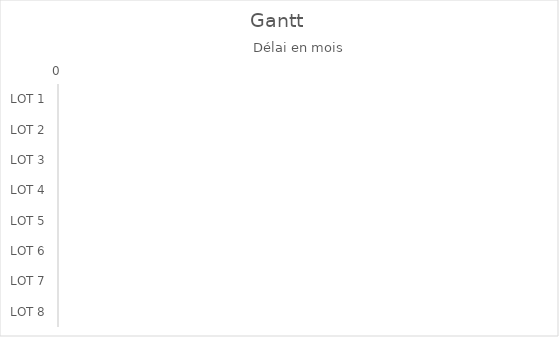
| Category | Series 0 | Series 1 |
|---|---|---|
| LOT 1 | 0 | 0 |
| LOT 2 | 0 | 0 |
| LOT 3 | 0 | 0 |
| LOT 4 | 0 | 0 |
| LOT 5 | 0 | 0 |
| LOT 6 | 0 | 0 |
| LOT 7 | 0 | 0 |
| LOT 8 | 0 | 0 |